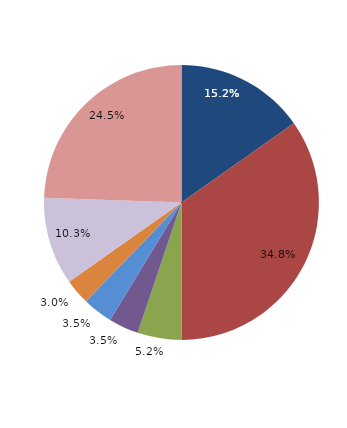
| Category | Series 0 |
|---|---|
| قبل الدخول | 15.217 |
| -1 | 34.783 |
| 1 | 5.163 |
| 2 | 3.533 |
| 3 | 3.533 |
| 4 | 2.989 |
|  5 - 9 | 10.326 |
| 10 - 14 | 24.457 |